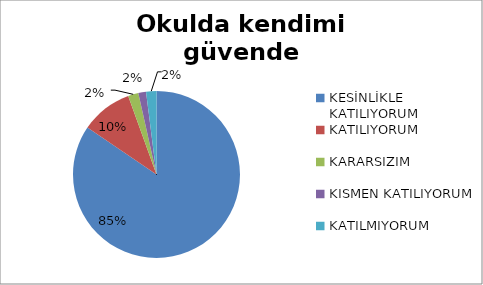
| Category | Okulda kendimi güvende hissediyorum. |
|---|---|
| KESİNLİKLE KATILIYORUM | 169 |
| KATILIYORUM | 20 |
| KARARSIZIM | 4 |
| KISMEN KATILIYORUM | 3 |
| KATILMIYORUM | 4 |